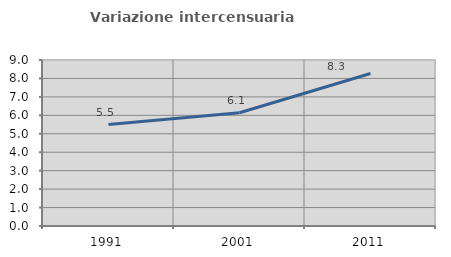
| Category | Variazione intercensuaria annua |
|---|---|
| 1991.0 | 5.499 |
| 2001.0 | 6.139 |
| 2011.0 | 8.265 |